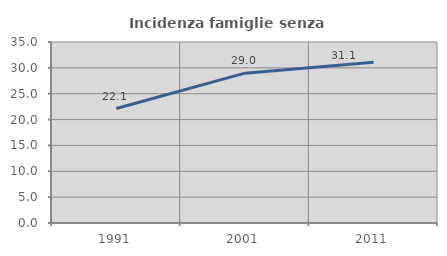
| Category | Incidenza famiglie senza nuclei |
|---|---|
| 1991.0 | 22.133 |
| 2001.0 | 28.975 |
| 2011.0 | 31.073 |